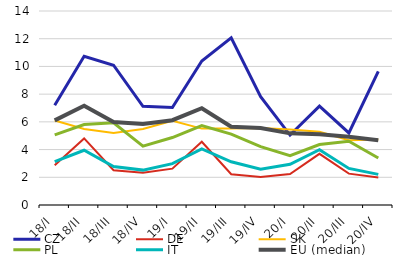
| Category | CZ | DE | SK | PL | IT | EU (median) |
|---|---|---|---|---|---|---|
| 18/I | 7.2 | 2.862 | 6.099 | 5.066 | 3.125 | 6.106 |
| 18/II | 10.732 | 4.804 | 5.482 | 5.812 | 3.952 | 7.17 |
| 18/III | 10.089 | 2.508 | 5.202 | 5.927 | 2.779 | 5.986 |
| 18/IV | 7.123 | 2.331 | 5.48 | 4.25 | 2.518 | 5.85 |
| 19/I | 7.03 | 2.625 | 6.073 | 4.867 | 2.983 | 6.121 |
| 19/II | 10.391 | 4.562 | 5.514 | 5.725 | 4.052 | 6.983 |
| 19/III | 12.058 | 2.218 | 5.521 | 5.114 | 3.119 | 5.647 |
| 19/IV | 7.824 | 2.022 | 5.559 | 4.208 | 2.575 | 5.557 |
| 20/I | 5.044 | 2.231 | 5.445 | 3.559 | 2.934 | 5.169 |
| 20/II | 7.137 | 3.693 | 5.291 | 4.36 | 3.987 | 5.111 |
| 20/III | 5.199 | 2.263 | 4.668 | 4.604 | 2.639 | 4.932 |
| 20/IV | 9.646 | 1.981 | 4.725 | 3.397 | 2.209 | 4.667 |